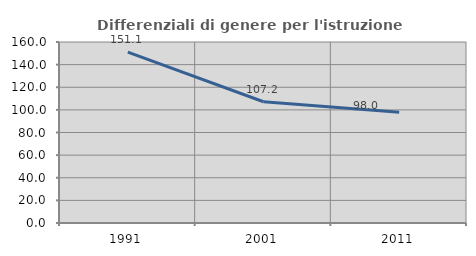
| Category | Differenziali di genere per l'istruzione superiore |
|---|---|
| 1991.0 | 151.111 |
| 2001.0 | 107.2 |
| 2011.0 | 97.965 |